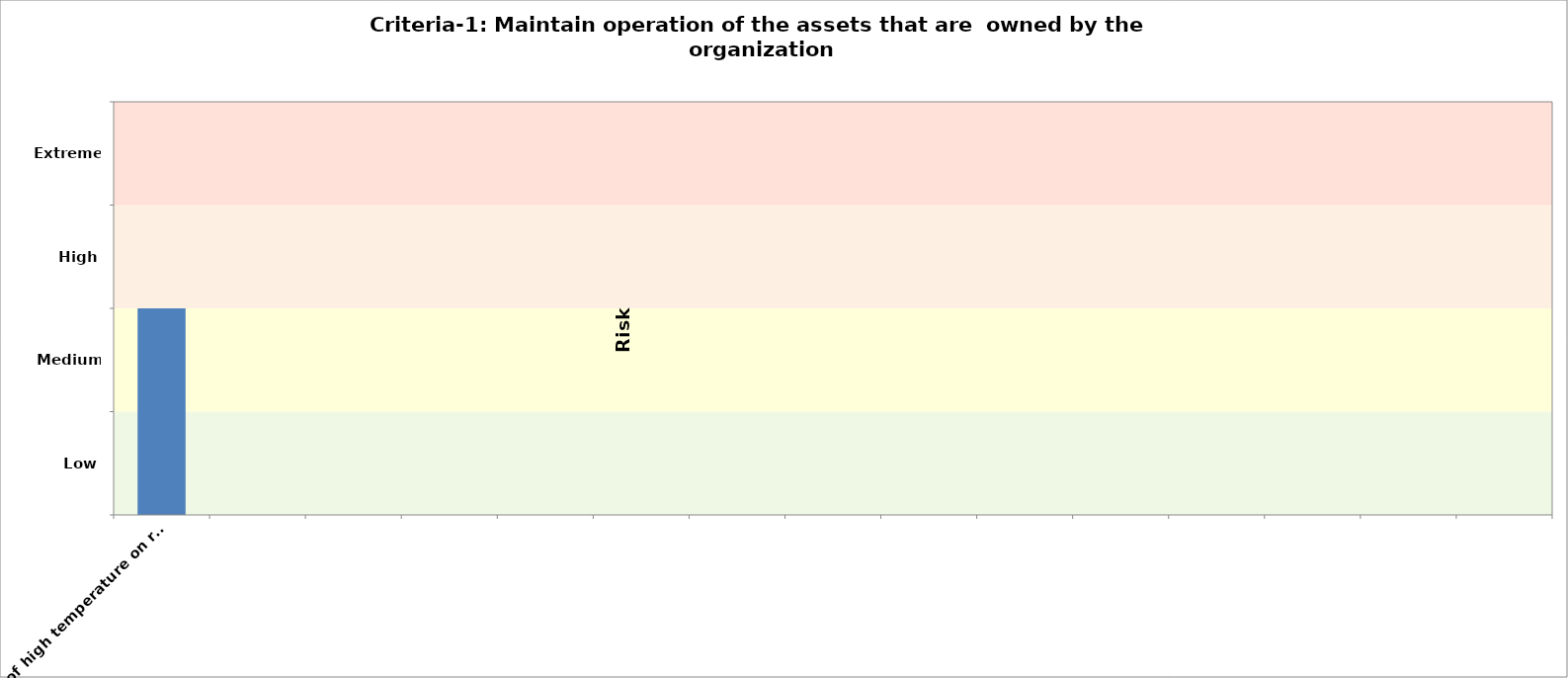
| Category | Criteria-2 (Community asset) | Criteria-1 2050 |
|---|---|---|
| e.g. effect of high temperature on road pavement  |  | 2 |